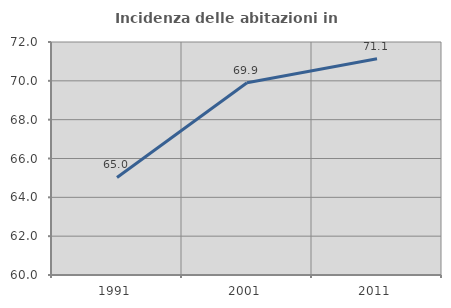
| Category | Incidenza delle abitazioni in proprietà  |
|---|---|
| 1991.0 | 65.022 |
| 2001.0 | 69.902 |
| 2011.0 | 71.135 |